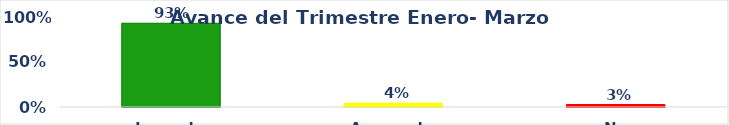
| Category | Series 0 | Series 1 |
|---|---|---|
| Logrado | 0.931 |  |
| Avanzado | 0.042 |  |
| No logrado | 0.028 |  |